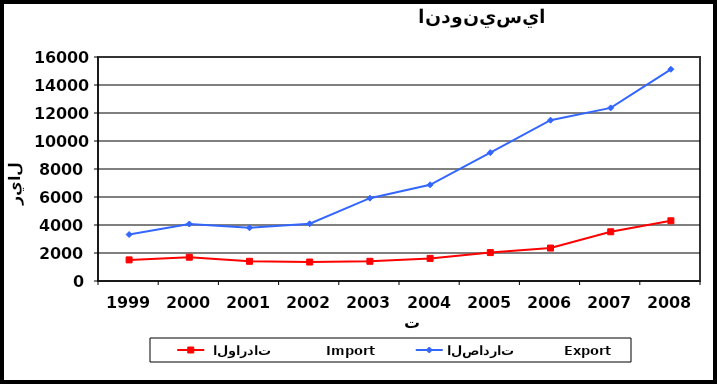
| Category |  الواردات           Import | الصادرات          Export |
|---|---|---|
| 1999.0 | 1508 | 3318 |
| 2000.0 | 1699 | 4071 |
| 2001.0 | 1407 | 3802 |
| 2002.0 | 1355 | 4088 |
| 2003.0 | 1408 | 5917 |
| 2004.0 | 1614 | 6871 |
| 2005.0 | 2030 | 9170 |
| 2006.0 | 2354 | 11484 |
| 2007.0 | 3516 | 12366 |
| 2008.0 | 4301 | 15122 |